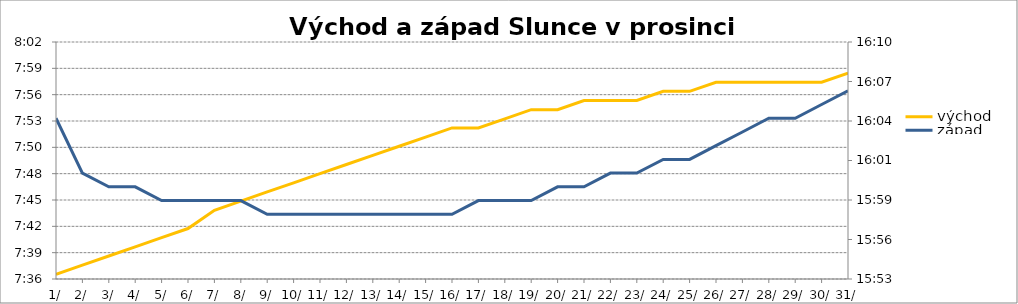
| Category | východ |
|---|---|
| 2015-12-01 | 0.317 |
| 2015-12-02 | 0.318 |
| 2015-12-03 | 0.319 |
| 2015-12-04 | 0.319 |
| 2015-12-05 | 0.32 |
| 2015-12-06 | 0.321 |
| 2015-12-07 | 0.322 |
| 2015-12-08 | 0.323 |
| 2015-12-09 | 0.324 |
| 2015-12-10 | 0.324 |
| 2015-12-11 | 0.325 |
| 2015-12-12 | 0.326 |
| 2015-12-13 | 0.326 |
| 2015-12-14 | 0.327 |
| 2015-12-15 | 0.328 |
| 2015-12-16 | 0.328 |
| 2015-12-17 | 0.328 |
| 2015-12-18 | 0.329 |
| 2015-12-19 | 0.33 |
| 2015-12-20 | 0.33 |
| 2015-12-21 | 0.331 |
| 2015-12-22 | 0.331 |
| 2015-12-23 | 0.331 |
| 2015-12-24 | 0.331 |
| 2015-12-25 | 0.331 |
| 2015-12-26 | 0.332 |
| 2015-12-27 | 0.332 |
| 2015-12-28 | 0.332 |
| 2015-12-29 | 0.332 |
| 2015-12-30 | 0.332 |
| 2015-12-31 | 0.333 |